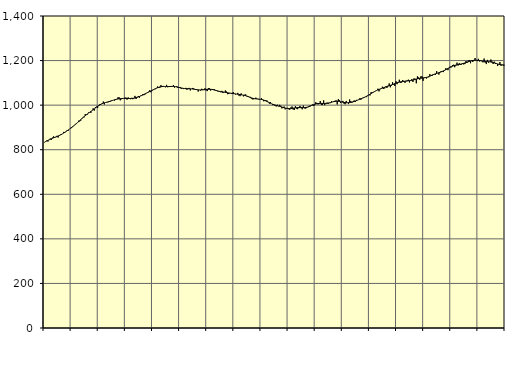
| Category | Piggar | Series 1 |
|---|---|---|
| nan | 832.9 | 834.31 |
| 87.0 | 836.7 | 836.96 |
| 87.0 | 841 | 839.25 |
| 87.0 | 836.7 | 841.65 |
| 87.0 | 844.2 | 844.15 |
| 87.0 | 850 | 846.66 |
| 87.0 | 844.2 | 849.11 |
| 87.0 | 854.3 | 851.34 |
| 87.0 | 859.7 | 853.43 |
| 87.0 | 853.7 | 855.38 |
| 87.0 | 856.7 | 857.27 |
| 87.0 | 862.3 | 859.2 |
| nan | 854.8 | 861.26 |
| 88.0 | 862.1 | 863.51 |
| 88.0 | 867.4 | 866 |
| 88.0 | 866.3 | 868.75 |
| 88.0 | 872 | 871.75 |
| 88.0 | 879.9 | 874.96 |
| 88.0 | 876.8 | 878.32 |
| 88.0 | 881.6 | 881.76 |
| 88.0 | 887.5 | 885.24 |
| 88.0 | 885.5 | 888.79 |
| 88.0 | 892.4 | 892.43 |
| 88.0 | 898.1 | 896.17 |
| nan | 896.9 | 900.02 |
| 89.0 | 905.5 | 904 |
| 89.0 | 908.3 | 908.07 |
| 89.0 | 913.2 | 912.25 |
| 89.0 | 915.2 | 916.54 |
| 89.0 | 920.8 | 920.94 |
| 89.0 | 929.9 | 925.47 |
| 89.0 | 927 | 930.12 |
| 89.0 | 930.2 | 934.78 |
| 89.0 | 941.1 | 939.45 |
| 89.0 | 944.8 | 944.04 |
| 89.0 | 945.4 | 948.48 |
| nan | 959.5 | 952.77 |
| 90.0 | 958.5 | 956.88 |
| 90.0 | 958.3 | 960.79 |
| 90.0 | 967 | 964.54 |
| 90.0 | 967.7 | 968.17 |
| 90.0 | 965.4 | 971.75 |
| 90.0 | 975.5 | 975.38 |
| 90.0 | 985.7 | 979.12 |
| 90.0 | 975.5 | 983.03 |
| 90.0 | 990.7 | 987.04 |
| 90.0 | 993.2 | 991.03 |
| 90.0 | 987.8 | 994.87 |
| nan | 1000.6 | 998.42 |
| 91.0 | 1004.5 | 1001.59 |
| 91.0 | 1003.9 | 1004.35 |
| 91.0 | 1008.2 | 1006.72 |
| 91.0 | 1016.2 | 1008.72 |
| 91.0 | 1003.3 | 1010.43 |
| 91.0 | 1012.3 | 1011.91 |
| 91.0 | 1011.9 | 1013.18 |
| 91.0 | 1012.9 | 1014.43 |
| 91.0 | 1017.4 | 1015.8 |
| 91.0 | 1015.9 | 1017.34 |
| 91.0 | 1020.7 | 1019.03 |
| nan | 1019.9 | 1020.82 |
| 92.0 | 1022.4 | 1022.54 |
| 92.0 | 1020.5 | 1024.16 |
| 92.0 | 1027.6 | 1025.59 |
| 92.0 | 1026.2 | 1026.8 |
| 92.0 | 1035 | 1027.8 |
| 92.0 | 1035 | 1028.63 |
| 92.0 | 1021.6 | 1029.26 |
| 92.0 | 1026.5 | 1029.73 |
| 92.0 | 1027.8 | 1029.97 |
| 92.0 | 1030.8 | 1030.05 |
| 92.0 | 1033.7 | 1030.01 |
| nan | 1033.9 | 1029.89 |
| 93.0 | 1024.6 | 1029.78 |
| 93.0 | 1034.8 | 1029.74 |
| 93.0 | 1027.9 | 1029.79 |
| 93.0 | 1026.6 | 1029.94 |
| 93.0 | 1032.5 | 1030.22 |
| 93.0 | 1026.6 | 1030.7 |
| 93.0 | 1029.2 | 1031.45 |
| 93.0 | 1041.5 | 1032.51 |
| 93.0 | 1027.5 | 1033.82 |
| 93.0 | 1037 | 1035.33 |
| 93.0 | 1041.1 | 1037.01 |
| nan | 1033.4 | 1038.89 |
| 94.0 | 1042.1 | 1040.96 |
| 94.0 | 1042.1 | 1043.21 |
| 94.0 | 1049.4 | 1045.6 |
| 94.0 | 1045 | 1048.1 |
| 94.0 | 1048.4 | 1050.66 |
| 94.0 | 1053.9 | 1053.23 |
| 94.0 | 1057.7 | 1055.83 |
| 94.0 | 1059.8 | 1058.39 |
| 94.0 | 1066.6 | 1060.9 |
| 94.0 | 1058 | 1063.42 |
| 94.0 | 1063 | 1065.93 |
| nan | 1069 | 1068.47 |
| 95.0 | 1070.6 | 1071.04 |
| 95.0 | 1071.5 | 1073.58 |
| 95.0 | 1077.1 | 1076 |
| 95.0 | 1083.6 | 1078.22 |
| 95.0 | 1077.2 | 1080.15 |
| 95.0 | 1077.7 | 1081.7 |
| 95.0 | 1089.9 | 1082.76 |
| 95.0 | 1082.2 | 1083.38 |
| 95.0 | 1086.3 | 1083.64 |
| 95.0 | 1083.9 | 1083.66 |
| 95.0 | 1080.1 | 1083.6 |
| nan | 1091 | 1083.54 |
| 96.0 | 1080.2 | 1083.52 |
| 96.0 | 1084.3 | 1083.58 |
| 96.0 | 1082.9 | 1083.69 |
| 96.0 | 1083.1 | 1083.79 |
| 96.0 | 1084.2 | 1083.82 |
| 96.0 | 1090.3 | 1083.7 |
| 96.0 | 1079 | 1083.34 |
| 96.0 | 1083.4 | 1082.69 |
| 96.0 | 1085.2 | 1081.76 |
| 96.0 | 1076.8 | 1080.64 |
| 96.0 | 1080.2 | 1079.43 |
| nan | 1081.6 | 1078.21 |
| 97.0 | 1072.6 | 1077.03 |
| 97.0 | 1077.1 | 1075.96 |
| 97.0 | 1072.2 | 1075.08 |
| 97.0 | 1075.1 | 1074.41 |
| 97.0 | 1077.5 | 1073.99 |
| 97.0 | 1068.9 | 1073.76 |
| 97.0 | 1075.2 | 1073.63 |
| 97.0 | 1077.4 | 1073.52 |
| 97.0 | 1066.2 | 1073.31 |
| 97.0 | 1072.6 | 1072.93 |
| 97.0 | 1077.1 | 1072.37 |
| nan | 1075.3 | 1071.64 |
| 98.0 | 1071.5 | 1070.86 |
| 98.0 | 1070.4 | 1070.09 |
| 98.0 | 1069.6 | 1069.37 |
| 98.0 | 1061.1 | 1068.79 |
| 98.0 | 1068.7 | 1068.4 |
| 98.0 | 1065.9 | 1068.23 |
| 98.0 | 1073.3 | 1068.31 |
| 98.0 | 1071.2 | 1068.62 |
| 98.0 | 1070 | 1069.1 |
| 98.0 | 1075.7 | 1069.72 |
| 98.0 | 1065.9 | 1070.33 |
| nan | 1063.1 | 1070.82 |
| 99.0 | 1076.6 | 1071.14 |
| 99.0 | 1075.5 | 1071.21 |
| 99.0 | 1065.4 | 1070.99 |
| 99.0 | 1072.3 | 1070.5 |
| 99.0 | 1072 | 1069.68 |
| 99.0 | 1071.9 | 1068.52 |
| 99.0 | 1065.1 | 1067.14 |
| 99.0 | 1067.7 | 1065.67 |
| 99.0 | 1062 | 1064.23 |
| 99.0 | 1061.6 | 1062.89 |
| 99.0 | 1059.5 | 1061.7 |
| nan | 1057.7 | 1060.68 |
| 0.0 | 1063.9 | 1059.75 |
| 0.0 | 1054.4 | 1058.87 |
| 0.0 | 1058.3 | 1058.04 |
| 0.0 | 1065.8 | 1057.22 |
| 0.0 | 1061.3 | 1056.38 |
| 0.0 | 1049.1 | 1055.57 |
| 0.0 | 1050.1 | 1054.76 |
| 0.0 | 1053.8 | 1053.97 |
| 0.0 | 1052.3 | 1053.22 |
| 0.0 | 1050 | 1052.51 |
| 0.0 | 1058.9 | 1051.82 |
| nan | 1052.3 | 1051.13 |
| 1.0 | 1048 | 1050.41 |
| 1.0 | 1049.5 | 1049.67 |
| 1.0 | 1055 | 1048.91 |
| 1.0 | 1042.9 | 1048.1 |
| 1.0 | 1040.3 | 1047.28 |
| 1.0 | 1052.6 | 1046.5 |
| 1.0 | 1045.6 | 1045.75 |
| 1.0 | 1039.3 | 1044.87 |
| 1.0 | 1046.5 | 1043.76 |
| 1.0 | 1048.2 | 1042.36 |
| 1.0 | 1039.6 | 1040.68 |
| nan | 1041.1 | 1038.77 |
| 2.0 | 1036.4 | 1036.71 |
| 2.0 | 1037.2 | 1034.64 |
| 2.0 | 1029.3 | 1032.71 |
| 2.0 | 1026.1 | 1031.07 |
| 2.0 | 1026.3 | 1029.82 |
| 2.0 | 1028.1 | 1028.91 |
| 2.0 | 1033.7 | 1028.26 |
| 2.0 | 1028.9 | 1027.85 |
| 2.0 | 1026.9 | 1027.51 |
| 2.0 | 1025 | 1027.05 |
| 2.0 | 1025.7 | 1026.39 |
| nan | 1030.9 | 1025.44 |
| 3.0 | 1025.9 | 1024.17 |
| 3.0 | 1017.3 | 1022.59 |
| 3.0 | 1019.3 | 1020.7 |
| 3.0 | 1021.2 | 1018.56 |
| 3.0 | 1020 | 1016.19 |
| 3.0 | 1012.6 | 1013.62 |
| 3.0 | 1006.8 | 1010.99 |
| 3.0 | 1013.5 | 1008.41 |
| 3.0 | 1006.1 | 1005.99 |
| 3.0 | 999.9 | 1003.84 |
| 3.0 | 1003.4 | 1001.96 |
| nan | 996.5 | 1000.3 |
| 4.0 | 994 | 998.82 |
| 4.0 | 1002.1 | 997.5 |
| 4.0 | 994.8 | 996.21 |
| 4.0 | 1001.4 | 994.81 |
| 4.0 | 997.3 | 993.27 |
| 4.0 | 985.4 | 991.65 |
| 4.0 | 988.9 | 989.99 |
| 4.0 | 993.9 | 988.4 |
| 4.0 | 981.2 | 987.02 |
| 4.0 | 985.1 | 985.97 |
| 4.0 | 987.8 | 985.27 |
| nan | 981.7 | 984.92 |
| 5.0 | 979.4 | 984.98 |
| 5.0 | 989.5 | 985.33 |
| 5.0 | 993.9 | 985.86 |
| 5.0 | 980.6 | 986.52 |
| 5.0 | 978.6 | 987.23 |
| 5.0 | 995.3 | 987.91 |
| 5.0 | 984.5 | 988.49 |
| 5.0 | 981.8 | 988.85 |
| 5.0 | 991.6 | 989 |
| 5.0 | 996.5 | 988.98 |
| 5.0 | 991.9 | 988.9 |
| nan | 981.4 | 988.86 |
| 6.0 | 997.7 | 988.94 |
| 6.0 | 985.5 | 989.18 |
| 6.0 | 984.8 | 989.67 |
| 6.0 | 986.7 | 990.52 |
| 6.0 | 991.3 | 991.77 |
| 6.0 | 995.5 | 993.39 |
| 6.0 | 998.2 | 995.37 |
| 6.0 | 996.4 | 997.56 |
| 6.0 | 1003 | 999.79 |
| 6.0 | 997.2 | 1001.87 |
| 6.0 | 999.2 | 1003.67 |
| nan | 1013.1 | 1005.15 |
| 7.0 | 1009.8 | 1006.28 |
| 7.0 | 1003.2 | 1007.05 |
| 7.0 | 1004.6 | 1007.51 |
| 7.0 | 1018.5 | 1007.72 |
| 7.0 | 1000.5 | 1007.75 |
| 7.0 | 1000.4 | 1007.64 |
| 7.0 | 1021.6 | 1007.51 |
| 7.0 | 999.8 | 1007.56 |
| 7.0 | 1006.9 | 1007.87 |
| 7.0 | 1011.3 | 1008.45 |
| 7.0 | 1005.4 | 1009.36 |
| nan | 1009.3 | 1010.52 |
| 8.0 | 1009 | 1011.82 |
| 8.0 | 1017.5 | 1013.21 |
| 8.0 | 1014.4 | 1014.62 |
| 8.0 | 1014.3 | 1015.85 |
| 8.0 | 1019.6 | 1016.76 |
| 8.0 | 1021.4 | 1017.32 |
| 8.0 | 1003.1 | 1017.43 |
| 8.0 | 1026.9 | 1017.07 |
| 8.0 | 1022 | 1016.36 |
| 8.0 | 1010.4 | 1015.4 |
| 8.0 | 1013.2 | 1014.28 |
| nan | 1019.2 | 1013.17 |
| 9.0 | 1006.9 | 1012.18 |
| 9.0 | 1004 | 1011.39 |
| 9.0 | 1018.9 | 1010.88 |
| 9.0 | 1012 | 1010.71 |
| 9.0 | 1004.9 | 1010.9 |
| 9.0 | 1025.5 | 1011.48 |
| 9.0 | 1018.2 | 1012.42 |
| 9.0 | 1011.2 | 1013.68 |
| 9.0 | 1013.7 | 1015.11 |
| 9.0 | 1020.9 | 1016.74 |
| 9.0 | 1013.9 | 1018.55 |
| nan | 1023.6 | 1020.46 |
| 10.0 | 1022 | 1022.45 |
| 10.0 | 1023.8 | 1024.48 |
| 10.0 | 1030.7 | 1026.49 |
| 10.0 | 1024.4 | 1028.45 |
| 10.0 | 1030.7 | 1030.46 |
| 10.0 | 1034.3 | 1032.57 |
| 10.0 | 1036.2 | 1034.82 |
| 10.0 | 1037.8 | 1037.22 |
| 10.0 | 1036 | 1039.87 |
| 10.0 | 1041.3 | 1042.76 |
| 10.0 | 1046.8 | 1045.82 |
| nan | 1043.4 | 1048.96 |
| 11.0 | 1058 | 1052.08 |
| 11.0 | 1057.4 | 1055.16 |
| 11.0 | 1056.6 | 1058.13 |
| 11.0 | 1062.2 | 1060.98 |
| 11.0 | 1063.1 | 1063.68 |
| 11.0 | 1066 | 1066.13 |
| 11.0 | 1073.7 | 1068.38 |
| 11.0 | 1061.8 | 1070.5 |
| 11.0 | 1071.5 | 1072.5 |
| 11.0 | 1075.9 | 1074.43 |
| 11.0 | 1082.8 | 1076.35 |
| nan | 1073.1 | 1078.24 |
| 12.0 | 1075.1 | 1080.11 |
| 12.0 | 1084.2 | 1081.9 |
| 12.0 | 1077 | 1083.6 |
| 12.0 | 1087 | 1085.28 |
| 12.0 | 1097.4 | 1086.99 |
| 12.0 | 1080 | 1088.75 |
| 12.0 | 1087.5 | 1090.61 |
| 12.0 | 1102.9 | 1092.59 |
| 12.0 | 1091.4 | 1094.69 |
| 12.0 | 1086.2 | 1096.75 |
| 12.0 | 1107.3 | 1098.65 |
| nan | 1094.2 | 1100.4 |
| 13.0 | 1104.1 | 1101.97 |
| 13.0 | 1114 | 1103.34 |
| 13.0 | 1100.2 | 1104.5 |
| 13.0 | 1101.4 | 1105.44 |
| 13.0 | 1112.7 | 1106.13 |
| 13.0 | 1104.5 | 1106.74 |
| 13.0 | 1100 | 1107.31 |
| 13.0 | 1109.2 | 1107.8 |
| 13.0 | 1111.1 | 1108.31 |
| 13.0 | 1114.2 | 1108.92 |
| 13.0 | 1101.9 | 1109.62 |
| nan | 1112.6 | 1110.46 |
| 14.0 | 1116.5 | 1111.5 |
| 14.0 | 1104 | 1112.68 |
| 14.0 | 1120.1 | 1113.99 |
| 14.0 | 1118.2 | 1115.41 |
| 14.0 | 1098.1 | 1116.84 |
| 14.0 | 1129.2 | 1118.12 |
| 14.0 | 1124.6 | 1119.22 |
| 14.0 | 1114.1 | 1120.12 |
| 14.0 | 1128.5 | 1120.8 |
| 14.0 | 1130.1 | 1121.36 |
| 14.0 | 1109.1 | 1121.93 |
| nan | 1124.9 | 1122.61 |
| 15.0 | 1122.4 | 1123.45 |
| 15.0 | 1119.6 | 1124.61 |
| 15.0 | 1125.1 | 1126.17 |
| 15.0 | 1125.1 | 1128.05 |
| 15.0 | 1139 | 1130.2 |
| 15.0 | 1134.3 | 1132.52 |
| 15.0 | 1130.8 | 1134.79 |
| 15.0 | 1139.5 | 1136.92 |
| 15.0 | 1137.2 | 1138.84 |
| 15.0 | 1136.3 | 1140.56 |
| 15.0 | 1152.5 | 1142.2 |
| nan | 1144.3 | 1143.84 |
| 16.0 | 1137 | 1145.53 |
| 16.0 | 1146.8 | 1147.32 |
| 16.0 | 1152.9 | 1149.25 |
| 16.0 | 1153.2 | 1151.37 |
| 16.0 | 1148.3 | 1153.7 |
| 16.0 | 1154.7 | 1156.17 |
| 16.0 | 1165 | 1158.81 |
| 16.0 | 1163.4 | 1161.56 |
| 16.0 | 1156.9 | 1164.35 |
| 16.0 | 1166.3 | 1167.13 |
| 16.0 | 1173.3 | 1169.81 |
| nan | 1169.7 | 1172.32 |
| 17.0 | 1180.1 | 1174.66 |
| 17.0 | 1181.3 | 1176.75 |
| 17.0 | 1170.1 | 1178.51 |
| 17.0 | 1177 | 1179.91 |
| 17.0 | 1190.6 | 1181.02 |
| 17.0 | 1177.8 | 1181.98 |
| 17.0 | 1188.4 | 1182.89 |
| 17.0 | 1180.3 | 1183.86 |
| 17.0 | 1182.4 | 1185.03 |
| 17.0 | 1188.6 | 1186.36 |
| 17.0 | 1182.6 | 1187.81 |
| nan | 1184.7 | 1189.39 |
| 18.0 | 1198.1 | 1191.04 |
| 18.0 | 1189.9 | 1192.75 |
| 18.0 | 1200.2 | 1194.49 |
| 18.0 | 1202.1 | 1196.21 |
| 18.0 | 1188.1 | 1197.81 |
| 18.0 | 1201 | 1199.12 |
| 18.0 | 1193.7 | 1200.16 |
| 18.0 | 1200.5 | 1200.96 |
| 18.0 | 1211.2 | 1201.47 |
| 18.0 | 1201.8 | 1201.69 |
| 18.0 | 1197.5 | 1201.6 |
| nan | 1207.7 | 1201.17 |
| 19.0 | 1196 | 1200.41 |
| 19.0 | 1200.6 | 1199.44 |
| 19.0 | 1197.3 | 1198.38 |
| 19.0 | 1192.1 | 1197.38 |
| 19.0 | 1208.9 | 1196.56 |
| 19.0 | 1190.5 | 1196.05 |
| 19.0 | 1184.2 | 1195.75 |
| 19.0 | 1203 | 1195.5 |
| 19.0 | 1190.7 | 1195.14 |
| 19.0 | 1193.9 | 1194.58 |
| 19.0 | 1204.7 | 1193.8 |
| nan | 1195.7 | 1192.78 |
| 20.0 | 1184.8 | 1191.49 |
| 20.0 | 1195 | 1189.98 |
| 20.0 | 1184.9 | 1188.31 |
| 20.0 | 1187.9 | 1186.56 |
| 20.0 | 1175.5 | 1184.87 |
| 20.0 | 1184.3 | 1183.32 |
| 20.0 | 1193.1 | 1182.11 |
| 20.0 | 1176.8 | 1181.26 |
| 20.0 | 1181.8 | 1180.74 |
| 20.0 | 1177.4 | 1180.56 |
| 20.0 | 1178.8 | 1180.65 |